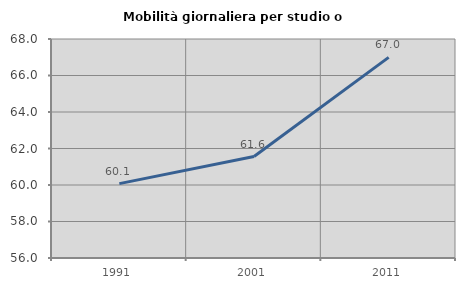
| Category | Mobilità giornaliera per studio o lavoro |
|---|---|
| 1991.0 | 60.076 |
| 2001.0 | 61.559 |
| 2011.0 | 66.991 |